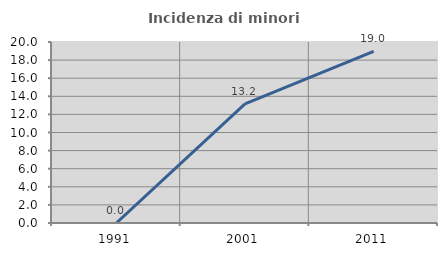
| Category | Incidenza di minori stranieri |
|---|---|
| 1991.0 | 0 |
| 2001.0 | 13.158 |
| 2011.0 | 18.974 |